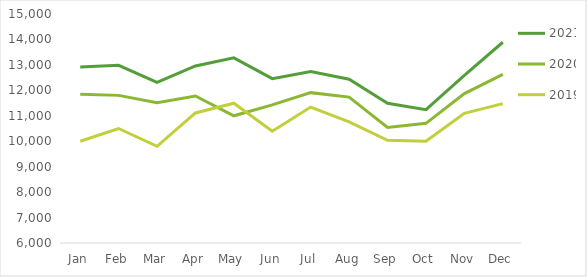
| Category | 2021 | 2020 | 2019 |
|---|---|---|---|
| Jan | 12913 | 11847 | 10000 |
| Feb | 12982 | 11802 | 10500 |
| Mar | 12317 | 11511 | 9800 |
| Apr | 12957 | 11779 | 11112 |
| May | 13275 | 11000 | 11493 |
| Jun | 12458 | 11429 | 10390 |
| Jul | 12743 | 11909 | 11342 |
| Aug | 12437 | 11733 | 10764 |
| Sep | 11490 | 10541 | 10039 |
| Oct | 11238 | 10703 | 10003 |
| Nov | 12584 | 11872 | 11095 |
| Dec | 13890 | 12627 | 11479 |